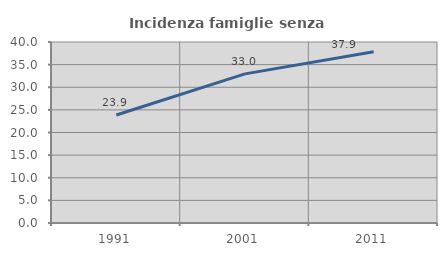
| Category | Incidenza famiglie senza nuclei |
|---|---|
| 1991.0 | 23.874 |
| 2001.0 | 32.953 |
| 2011.0 | 37.866 |